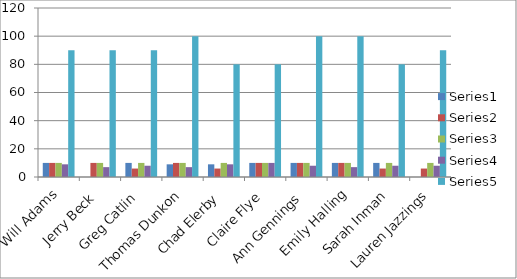
| Category | Series 0 | Series 1 | Series 2 | Series 3 | Series 4 |
|---|---|---|---|---|---|
| Will Adams | 10 | 10 | 10 | 9 | 90 |
| Jerry Beck | 0 | 10 | 10 | 7 | 90 |
| Greg Catlin | 10 | 6 | 10 | 8 | 90 |
| Thomas Dunkon | 9 | 10 | 10 | 7 | 100 |
|  Chad Elerby | 9 | 6 | 10 | 9 | 80 |
| Claire Flye | 10 | 10 | 10 | 10 | 80 |
| Ann Gennings | 10 | 10 | 10 | 8 | 100 |
| Emily Halling | 10 | 10 | 10 | 7 | 100 |
| Sarah Inman | 10 | 6 | 10 | 8 | 80 |
| Lauren Jazzings | 0 | 6 | 10 | 8 | 90 |